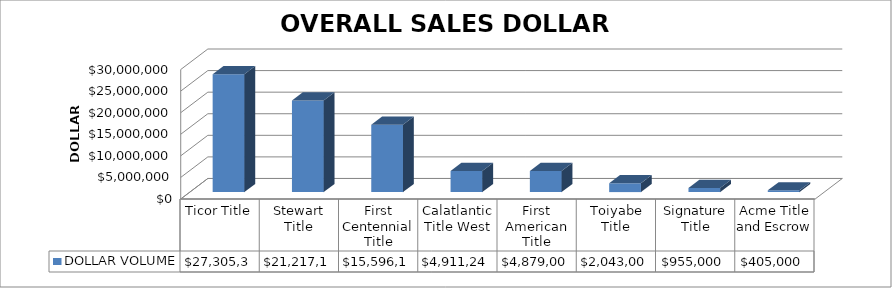
| Category | DOLLAR VOLUME |
|---|---|
| Ticor Title | 27305332.13 |
| Stewart Title | 21217101 |
| First Centennial Title | 15596162 |
| Calatlantic Title West | 4911243 |
| First American Title | 4879000 |
| Toiyabe Title | 2043000 |
| Signature Title | 955000 |
| Acme Title and Escrow | 405000 |